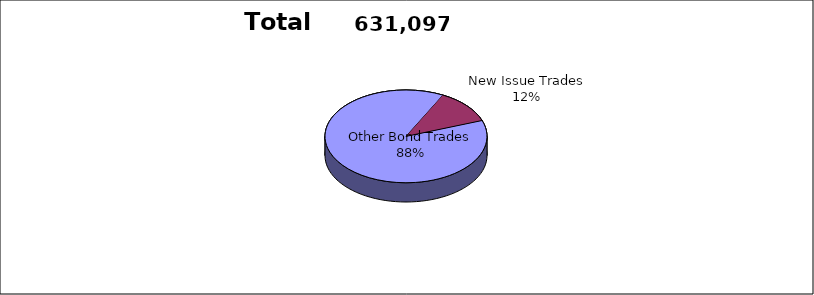
| Category | Series 0 |
|---|---|
| Other Bond Trades | 556034 |
| New Issue Trades | 75063 |